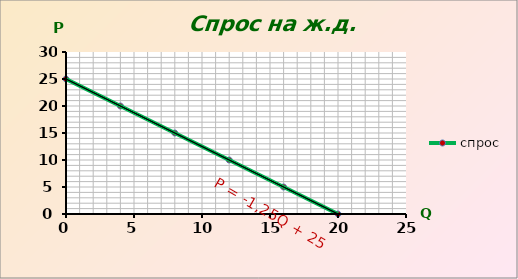
| Category | спрос |
|---|---|
| 0.0 | 25 |
| 4.0 | 20 |
| 8.0 | 15 |
| 12.0 | 10 |
| 16.0 | 5 |
| 20.0 | 0 |